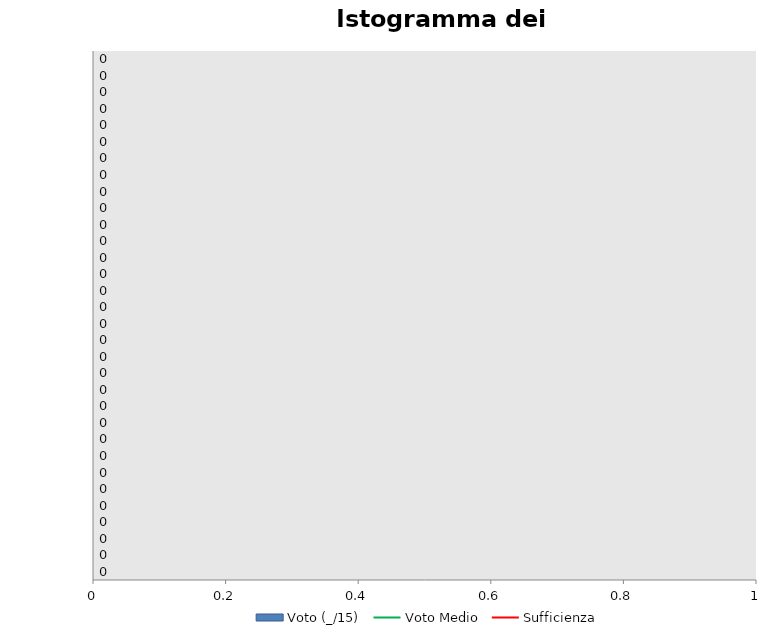
| Category | Voto (_/15) |
|---|---|
| 0 | 0 |
| 1 | 0 |
| 2 | 0 |
| 3 | 0 |
| 4 | 0 |
| 5 | 0 |
| 6 | 0 |
| 7 | 0 |
| 8 | 0 |
| 9 | 0 |
| 10 | 0 |
| 11 | 0 |
| 12 | 0 |
| 13 | 0 |
| 14 | 0 |
| 15 | 0 |
| 16 | 0 |
| 17 | 0 |
| 18 | 0 |
| 19 | 0 |
| 20 | 0 |
| 21 | 0 |
| 22 | 0 |
| 23 | 0 |
| 24 | 0 |
| 25 | 0 |
| 26 | 0 |
| 27 | 0 |
| 28 | 0 |
| 29 | 0 |
| 30 | 0 |
| 31 | 0 |